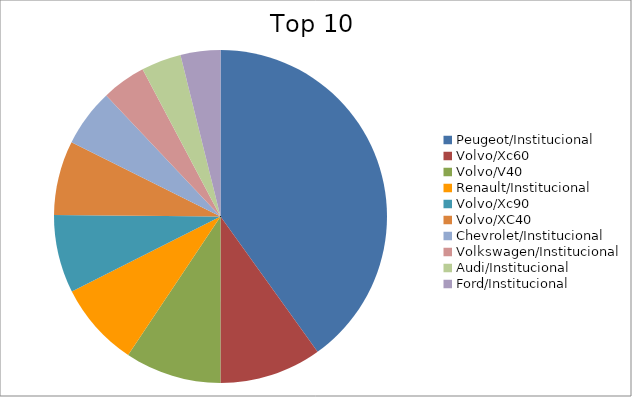
| Category | Series 0 |
|---|---|
| Peugeot/Institucional | 35.27 |
| Volvo/Xc60 | 8.72 |
| Volvo/V40 | 8.23 |
| Renault/Institucional | 7.22 |
| Volvo/Xc90 | 6.66 |
| Volvo/XC40 | 6.35 |
| Chevrolet/Institucional | 4.93 |
| Volkswagen/Institucional | 3.77 |
| Audi/Institucional | 3.42 |
| Ford/Institucional | 3.4 |